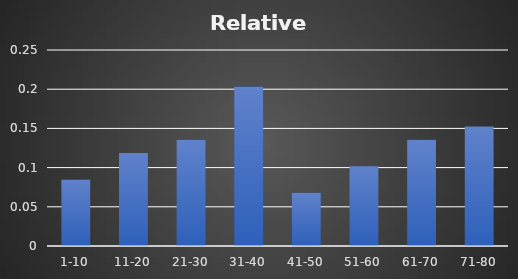
| Category | Relative Frequency |
|---|---|
| 1-10 | 0.085 |
| 11-20 | 0.119 |
| 21-30 | 0.136 |
| 31-40 | 0.203 |
| 41-50 | 0.068 |
| 51-60 | 0.102 |
| 61-70 | 0.136 |
| 71-80 | 0.153 |